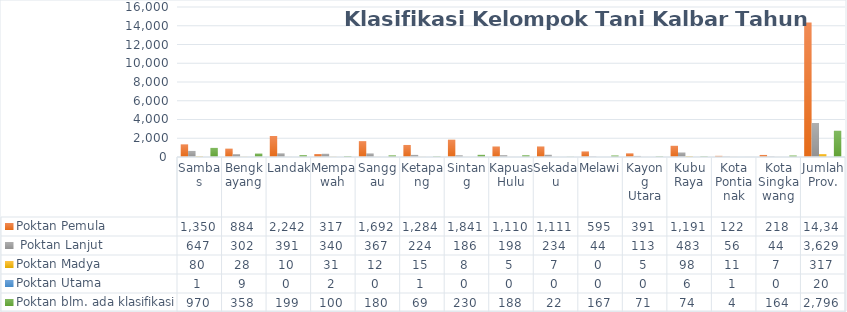
| Category | Poktan Pemula |  Poktan Lanjut | Poktan Madya | Poktan Utama | Poktan blm. ada klasifikasi |
|---|---|---|---|---|---|
| Sambas | 1350 | 647 | 80 | 1 | 970 |
| Bengkayang | 884 | 302 | 28 | 9 | 358 |
| Landak | 2242 | 391 | 10 | 0 | 199 |
| Mempawah | 317 | 340 | 31 | 2 | 100 |
| Sanggau | 1692 | 367 | 12 | 0 | 180 |
| Ketapang | 1284 | 224 | 15 | 1 | 69 |
| Sintang | 1841 | 186 | 8 | 0 | 230 |
| Kapuas Hulu | 1110 | 198 | 5 | 0 | 188 |
| Sekadau | 1111 | 234 | 7 | 0 | 22 |
| Melawi | 595 | 44 | 0 | 0 | 167 |
| Kayong Utara | 391 | 113 | 5 | 0 | 71 |
| Kubu Raya | 1191 | 483 | 98 | 6 | 74 |
| Kota Pontianak | 122 | 56 | 11 | 1 | 4 |
| Kota Singkawang | 218 | 44 | 7 | 0 | 164 |
| Jumlah Prov. | 14348 | 3629 | 317 | 20 | 2796 |